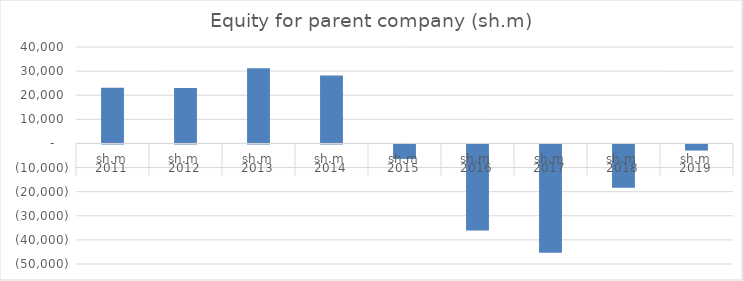
| Category | Equity for parent company (sh.m) |
|---|---|
| 0 | 23090 |
| 1 | 22962 |
| 2 | 31155 |
| 3 | 28186 |
| 4 | -6009 |
| 5 | -35718 |
| 6 | -44964 |
| 7 | -17946 |
| 8 | -2538 |